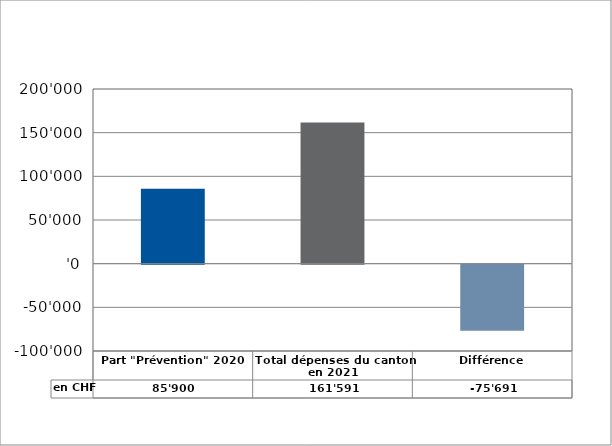
| Category | en CHF |
|---|---|
| Part "Prévention" 2020 | 85900 |
| Total dépenses du canton en 2021 | 161591 |
| Différence | -75691 |